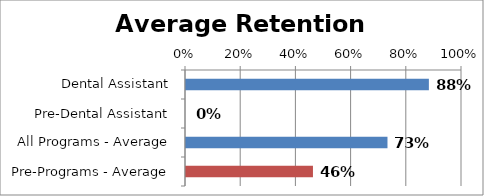
| Category | Series 0 |
|---|---|
| Dental Assistant | 0.88 |
| Pre-Dental Assistant | 0 |
| All Programs - Average | 0.73 |
| Pre-Programs - Average | 0.46 |